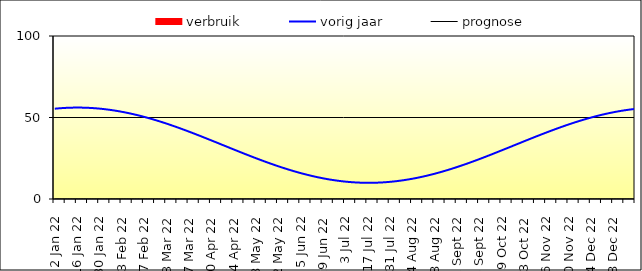
| Category | verbruik |
|---|---|
| 2022-01-02 | 0 |
| 2022-01-03 | 0 |
| 2022-01-04 | 0 |
| 2022-01-05 | 0 |
| 2022-01-06 | 0 |
| 2022-01-07 | 0 |
| 2022-01-08 | 0 |
| 2022-01-09 | 0 |
| 2022-01-10 | 0 |
| 2022-01-11 | 0 |
| 2022-01-12 | 0 |
| 2022-01-13 | 0 |
| 2022-01-14 | 0 |
| 2022-01-15 | 0 |
| 2022-01-16 | 0 |
| 2022-01-17 | 0 |
| 2022-01-18 | 0 |
| 2022-01-19 | 0 |
| 2022-01-20 | 0 |
| 2022-01-21 | 0 |
| 2022-01-22 | 0 |
| 2022-01-23 | 0 |
| 2022-01-24 | 0 |
| 2022-01-25 | 0 |
| 2022-01-26 | 0 |
| 2022-01-27 | 0 |
| 2022-01-28 | 0 |
| 2022-01-29 | 0 |
| 2022-01-30 | 0 |
| 2022-01-31 | 0 |
| 2022-02-01 | 0 |
| 2022-02-02 | 0 |
| 2022-02-03 | 0 |
| 2022-02-04 | 0 |
| 2022-02-05 | 0 |
| 2022-02-06 | 0 |
| 2022-02-07 | 0 |
| 2022-02-08 | 0 |
| 2022-02-09 | 0 |
| 2022-02-10 | 0 |
| 2022-02-11 | 0 |
| 2022-02-12 | 0 |
| 2022-02-13 | 0 |
| 2022-02-14 | 0 |
| 2022-02-15 | 0 |
| 2022-02-16 | 0 |
| 2022-02-17 | 0 |
| 2022-02-18 | 0 |
| 2022-02-19 | 0 |
| 2022-02-20 | 0 |
| 2022-02-21 | 0 |
| 2022-02-22 | 0 |
| 2022-02-23 | 0 |
| 2022-02-24 | 0 |
| 2022-02-25 | 0 |
| 2022-02-26 | 0 |
| 2022-02-27 | 0 |
| 2022-02-28 | 0 |
| 2022-03-01 | 0 |
| 2022-03-02 | 0 |
| 2022-03-03 | 0 |
| 2022-03-04 | 0 |
| 2022-03-05 | 0 |
| 2022-03-06 | 0 |
| 2022-03-07 | 0 |
| 2022-03-08 | 0 |
| 2022-03-09 | 0 |
| 2022-03-10 | 0 |
| 2022-03-11 | 0 |
| 2022-03-12 | 0 |
| 2022-03-13 | 0 |
| 2022-03-14 | 0 |
| 2022-03-15 | 0 |
| 2022-03-16 | 0 |
| 2022-03-17 | 0 |
| 2022-03-18 | 0 |
| 2022-03-19 | 0 |
| 2022-03-20 | 0 |
| 2022-03-21 | 0 |
| 2022-03-22 | 0 |
| 2022-03-23 | 0 |
| 2022-03-24 | 0 |
| 2022-03-25 | 0 |
| 2022-03-26 | 0 |
| 2022-03-27 | 0 |
| 2022-03-28 | 0 |
| 2022-03-29 | 0 |
| 2022-03-30 | 0 |
| 2022-03-31 | 0 |
| 2022-04-01 | 0 |
| 2022-04-02 | 0 |
| 2022-04-03 | 0 |
| 2022-04-04 | 0 |
| 2022-04-05 | 0 |
| 2022-04-06 | 0 |
| 2022-04-07 | 0 |
| 2022-04-08 | 0 |
| 2022-04-09 | 0 |
| 2022-04-10 | 0 |
| 2022-04-11 | 0 |
| 2022-04-12 | 0 |
| 2022-04-13 | 0 |
| 2022-04-14 | 0 |
| 2022-04-15 | 0 |
| 2022-04-16 | 0 |
| 2022-04-17 | 0 |
| 2022-04-18 | 0 |
| 2022-04-19 | 0 |
| 2022-04-20 | 0 |
| 2022-04-21 | 0 |
| 2022-04-22 | 0 |
| 2022-04-23 | 0 |
| 2022-04-24 | 0 |
| 2022-04-25 | 0 |
| 2022-04-26 | 0 |
| 2022-04-27 | 0 |
| 2022-04-28 | 0 |
| 2022-04-29 | 0 |
| 2022-04-30 | 0 |
| 2022-05-01 | 0 |
| 2022-05-02 | 0 |
| 2022-05-03 | 0 |
| 2022-05-04 | 0 |
| 2022-05-05 | 0 |
| 2022-05-06 | 0 |
| 2022-05-07 | 0 |
| 2022-05-08 | 0 |
| 2022-05-09 | 0 |
| 2022-05-10 | 0 |
| 2022-05-11 | 0 |
| 2022-05-12 | 0 |
| 2022-05-13 | 0 |
| 2022-05-14 | 0 |
| 2022-05-15 | 0 |
| 2022-05-16 | 0 |
| 2022-05-17 | 0 |
| 2022-05-18 | 0 |
| 2022-05-19 | 0 |
| 2022-05-20 | 0 |
| 2022-05-21 | 0 |
| 2022-05-22 | 0 |
| 2022-05-23 | 0 |
| 2022-05-24 | 0 |
| 2022-05-25 | 0 |
| 2022-05-26 | 0 |
| 2022-05-27 | 0 |
| 2022-05-28 | 0 |
| 2022-05-29 | 0 |
| 2022-05-30 | 0 |
| 2022-05-31 | 0 |
| 2022-06-01 | 0 |
| 2022-06-02 | 0 |
| 2022-06-03 | 0 |
| 2022-06-04 | 0 |
| 2022-06-05 | 0 |
| 2022-06-06 | 0 |
| 2022-06-07 | 0 |
| 2022-06-08 | 0 |
| 2022-06-09 | 0 |
| 2022-06-10 | 0 |
| 2022-06-11 | 0 |
| 2022-06-12 | 0 |
| 2022-06-13 | 0 |
| 2022-06-14 | 0 |
| 2022-06-15 | 0 |
| 2022-06-16 | 0 |
| 2022-06-17 | 0 |
| 2022-06-18 | 0 |
| 2022-06-19 | 0 |
| 2022-06-20 | 0 |
| 2022-06-21 | 0 |
| 2022-06-22 | 0 |
| 2022-06-23 | 0 |
| 2022-06-24 | 0 |
| 2022-06-25 | 0 |
| 2022-06-26 | 0 |
| 2022-06-27 | 0 |
| 2022-06-28 | 0 |
| 2022-06-29 | 0 |
| 2022-06-30 | 0 |
| 2022-07-01 | 0 |
| 2022-07-02 | 0 |
| 2022-07-03 | 0 |
| 2022-07-04 | 0 |
| 2022-07-05 | 0 |
| 2022-07-06 | 0 |
| 2022-07-07 | 0 |
| 2022-07-08 | 0 |
| 2022-07-09 | 0 |
| 2022-07-10 | 0 |
| 2022-07-11 | 0 |
| 2022-07-12 | 0 |
| 2022-07-13 | 0 |
| 2022-07-14 | 0 |
| 2022-07-15 | 0 |
| 2022-07-16 | 0 |
| 2022-07-17 | 0 |
| 2022-07-18 | 0 |
| 2022-07-19 | 0 |
| 2022-07-20 | 0 |
| 2022-07-21 | 0 |
| 2022-07-22 | 0 |
| 2022-07-23 | 0 |
| 2022-07-24 | 0 |
| 2022-07-25 | 0 |
| 2022-07-26 | 0 |
| 2022-07-27 | 0 |
| 2022-07-28 | 0 |
| 2022-07-29 | 0 |
| 2022-07-30 | 0 |
| 2022-07-31 | 0 |
| 2022-08-01 | 0 |
| 2022-08-02 | 0 |
| 2022-08-03 | 0 |
| 2022-08-04 | 0 |
| 2022-08-05 | 0 |
| 2022-08-06 | 0 |
| 2022-08-07 | 0 |
| 2022-08-08 | 0 |
| 2022-08-09 | 0 |
| 2022-08-10 | 0 |
| 2022-08-11 | 0 |
| 2022-08-12 | 0 |
| 2022-08-13 | 0 |
| 2022-08-14 | 0 |
| 2022-08-15 | 0 |
| 2022-08-16 | 0 |
| 2022-08-17 | 0 |
| 2022-08-18 | 0 |
| 2022-08-19 | 0 |
| 2022-08-20 | 0 |
| 2022-08-21 | 0 |
| 2022-08-22 | 0 |
| 2022-08-23 | 0 |
| 2022-08-24 | 0 |
| 2022-08-25 | 0 |
| 2022-08-26 | 0 |
| 2022-08-27 | 0 |
| 2022-08-28 | 0 |
| 2022-08-29 | 0 |
| 2022-08-30 | 0 |
| 2022-08-31 | 0 |
| 2022-09-01 | 0 |
| 2022-09-02 | 0 |
| 2022-09-03 | 0 |
| 2022-09-04 | 0 |
| 2022-09-05 | 0 |
| 2022-09-06 | 0 |
| 2022-09-07 | 0 |
| 2022-09-08 | 0 |
| 2022-09-09 | 0 |
| 2022-09-10 | 0 |
| 2022-09-11 | 0 |
| 2022-09-12 | 0 |
| 2022-09-13 | 0 |
| 2022-09-14 | 0 |
| 2022-09-15 | 0 |
| 2022-09-16 | 0 |
| 2022-09-17 | 0 |
| 2022-09-18 | 0 |
| 2022-09-19 | 0 |
| 2022-09-20 | 0 |
| 2022-09-21 | 0 |
| 2022-09-22 | 0 |
| 2022-09-23 | 0 |
| 2022-09-24 | 0 |
| 2022-09-25 | 0 |
| 2022-09-26 | 0 |
| 2022-09-27 | 0 |
| 2022-09-28 | 0 |
| 2022-09-29 | 0 |
| 2022-09-30 | 0 |
| 2022-10-01 | 0 |
| 2022-10-02 | 0 |
| 2022-10-03 | 0 |
| 2022-10-04 | 0 |
| 2022-10-05 | 0 |
| 2022-10-06 | 0 |
| 2022-10-07 | 0 |
| 2022-10-08 | 0 |
| 2022-10-09 | 0 |
| 2022-10-10 | 0 |
| 2022-10-11 | 0 |
| 2022-10-12 | 0 |
| 2022-10-13 | 0 |
| 2022-10-14 | 0 |
| 2022-10-15 | 0 |
| 2022-10-16 | 0 |
| 2022-10-17 | 0 |
| 2022-10-18 | 0 |
| 2022-10-19 | 0 |
| 2022-10-20 | 0 |
| 2022-10-21 | 0 |
| 2022-10-22 | 0 |
| 2022-10-23 | 0 |
| 2022-10-24 | 0 |
| 2022-10-25 | 0 |
| 2022-10-26 | 0 |
| 2022-10-27 | 0 |
| 2022-10-28 | 0 |
| 2022-10-29 | 0 |
| 2022-10-30 | 0 |
| 2022-10-31 | 0 |
| 2022-11-01 | 0 |
| 2022-11-02 | 0 |
| 2022-11-03 | 0 |
| 2022-11-04 | 0 |
| 2022-11-05 | 0 |
| 2022-11-06 | 0 |
| 2022-11-07 | 0 |
| 2022-11-08 | 0 |
| 2022-11-09 | 0 |
| 2022-11-10 | 0 |
| 2022-11-11 | 0 |
| 2022-11-12 | 0 |
| 2022-11-13 | 0 |
| 2022-11-14 | 0 |
| 2022-11-15 | 0 |
| 2022-11-16 | 0 |
| 2022-11-17 | 0 |
| 2022-11-18 | 0 |
| 2022-11-19 | 0 |
| 2022-11-20 | 0 |
| 2022-11-21 | 0 |
| 2022-11-22 | 0 |
| 2022-11-23 | 0 |
| 2022-11-24 | 0 |
| 2022-11-25 | 0 |
| 2022-11-26 | 0 |
| 2022-11-27 | 0 |
| 2022-11-28 | 0 |
| 2022-11-29 | 0 |
| 2022-11-30 | 0 |
| 2022-12-01 | 0 |
| 2022-12-02 | 0 |
| 2022-12-03 | 0 |
| 2022-12-04 | 0 |
| 2022-12-05 | 0 |
| 2022-12-06 | 0 |
| 2022-12-07 | 0 |
| 2022-12-08 | 0 |
| 2022-12-09 | 0 |
| 2022-12-10 | 0 |
| 2022-12-11 | 0 |
| 2022-12-12 | 0 |
| 2022-12-13 | 0 |
| 2022-12-14 | 0 |
| 2022-12-15 | 0 |
| 2022-12-16 | 0 |
| 2022-12-17 | 0 |
| 2022-12-18 | 0 |
| 2022-12-19 | 0 |
| 2022-12-20 | 0 |
| 2022-12-21 | 0 |
| 2022-12-22 | 0 |
| 2022-12-23 | 0 |
| 2022-12-24 | 0 |
| 2022-12-25 | 0 |
| 2022-12-26 | 0 |
| 2022-12-27 | 0 |
| 2022-12-28 | 0 |
| 2022-12-29 | 0 |
| 2022-12-30 | 0 |
| 2022-12-31 | 0 |